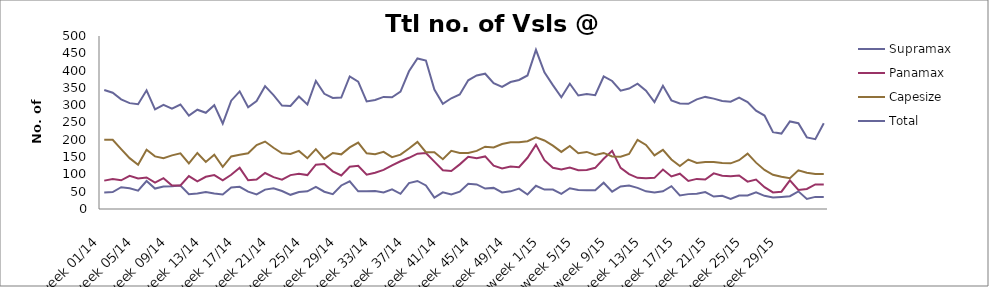
| Category | Supramax | Panamax | Capesize | Total |
|---|---|---|---|---|
| week 01/14 | 48 | 82 | 200 | 344 |
| week 02/14 | 49 | 87 | 200 | 336 |
| week 03/14 | 63 | 83 | 173 | 317 |
| week 04/14 | 60 | 96 | 147 | 306 |
| week 05/14 | 53 | 88 | 128 | 303 |
| week 06/14 | 81 | 91 | 171 | 343 |
| week 07/14 | 59 | 76 | 152 | 288 |
| week 08/14 | 65 | 89 | 147 | 301 |
| week 09/14 | 66 | 68 | 155 | 290 |
| week 10/14 | 68 | 68 | 161 | 302 |
| week 11/14 | 43 | 95 | 132 | 270 |
| week 12/14 | 45 | 80 | 162 | 287 |
| week 13/14 | 49 | 93 | 136 | 278 |
| week 14/14 | 45 | 98 | 157 | 300 |
| week 15/14 | 42 | 83 | 122 | 247 |
| week 16/14 | 62 | 99 | 152 | 313 |
| week 17/14 | 64 | 119 | 157 | 340 |
| week 18/14 | 50 | 83 | 161 | 294 |
| week 19/14 | 42 | 85 | 185 | 312 |
| week 20/14 | 56 | 104 | 195 | 355 |
| week 21/14 | 60 | 92 | 177 | 329 |
| week 22/14 | 52 | 85 | 161 | 299 |
| week 23/14 | 41 | 98 | 159 | 298 |
| week 24/14 | 49 | 102 | 168 | 325 |
| week 25/14 | 51 | 98 | 147 | 302 |
| week 26/14 | 64 | 128 | 173 | 370 |
| week 27/14 | 50 | 130 | 145 | 333 |
| week 28/14 | 43 | 109 | 162 | 321 |
| week 29/14 | 68 | 97 | 158 | 322 |
| week 30/14 | 80 | 122 | 178 | 383 |
| week 31/14 | 51 | 125 | 192 | 368 |
| week 32/14 | 51 | 99 | 161 | 311 |
| week 33/14 | 52 | 105 | 158 | 315 |
| week 34/14 | 48 | 113 | 165 | 324 |
| week 35/14 | 57 | 126 | 150 | 323 |
| week 36/14 | 44 | 138 | 157 | 339 |
| week 37/14 | 75 | 148 | 175 | 398 |
| week 38/14 | 81 | 160 | 194 | 435 |
| week 39/14 | 68 | 162 | 164 | 429 |
| week 40/14 | 33 | 137 | 164 | 345 |
| week 41/14 | 48 | 112 | 144 | 304 |
| week 42/14 | 42 | 110 | 168 | 320 |
| week 43/14 | 50 | 129 | 162 | 331 |
| week 44/14 | 73 | 151 | 162 | 372 |
| week 45/14 | 71 | 147 | 168 | 386 |
| week 46/14 | 59 | 152 | 180 | 391 |
| week 47/14 | 61 | 125 | 178 | 364 |
| week 48/14 | 48 | 117 | 188 | 353 |
| week 49/14 | 51 | 123 | 193 | 367 |
| week 50/14 | 59 | 121 | 193 | 373 |
| week 51/14 | 42 | 148 | 196 | 386 |
| week 52/14 | 67 | 186 | 207 | 460 |
| week 1/15 | 56 | 141 | 198 | 395 |
| week 2/15 | 56 | 119 | 183 | 358 |
| week 3/15 | 44 | 114 | 165 | 323 |
| week 4/15 | 60 | 120 | 182 | 362 |
| week 5/15 | 55 | 112 | 161 | 328 |
| week 6/15 | 54 | 113 | 165 | 332 |
| week 7/15 | 54 | 119 | 156 | 329 |
| week 8/15 | 76 | 145 | 162 | 383 |
| week 9/15 | 50 | 168 | 152 | 370 |
| week 10/15 | 65 | 119 | 151 | 342 |
| week 11/15 | 68 | 101 | 159 | 348 |
| week 12/15 | 61 | 90 | 200 | 362 |
| week 13/15 | 51 | 89 | 185 | 342 |
| week 14/15 | 48 | 90 | 155 | 309 |
| week 15/15 | 51 | 114 | 171 | 356 |
| week 16/15 | 66 | 94 | 143 | 314 |
| week 17/15 | 39 | 102 | 124 | 305 |
| week 18/15 | 43 | 81 | 143 | 304 |
| week 19/15 | 44 | 87 | 133 | 317 |
| week 20/15 | 49 | 85 | 136 | 324 |
| week 21/15 | 36 | 103 | 136 | 319 |
| week 22/15 | 38 | 96 | 133 | 312 |
| week 23/15 | 29 | 95 | 132 | 310 |
| week 24/15 | 39 | 97 | 141 | 322 |
| week 25/15 | 39 | 79 | 160 | 309 |
| week 26/15 | 48 | 85 | 134 | 284 |
| week 27/15 | 38 | 63 | 113 | 270 |
| week 28/15 | 33 | 48 | 99 | 222 |
| week 29/15 | 35 | 50 | 93 | 218 |
| week 30/15 | 37 | 83 | 89 | 253 |
| week 31/15 | 51 | 55 | 112 | 248 |